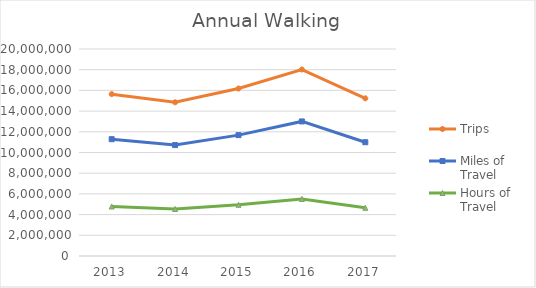
| Category | Trips | Miles of Travel | Hours of Travel |
|---|---|---|---|
| 2013 | 15638850 | 11285609 | 4781695.679 |
| 2014 | 14852999 | 10718508 | 4541415.842 |
| 2015 | 16182080 | 11677626 | 4947792.326 |
| 2016 | 18017867 | 13002401 | 5509097.969 |
| 2017 | 15233680 | 10993223 | 4657811.913 |